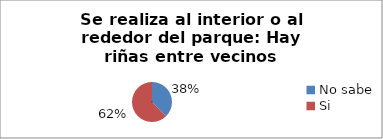
| Category | Series 0 |
|---|---|
| No sabe | 0.376 |
| Si | 0.624 |